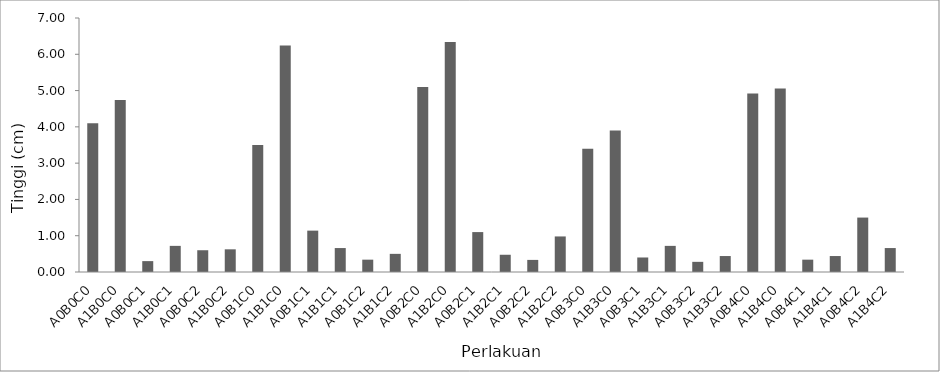
| Category | m22 |
|---|---|
| A0B0C0 | 4.1 |
| A1B0C0 | 4.74 |
| A0B0C1 | 0.3 |
| A1B0C1 | 0.72 |
| A0B0C2 | 0.6 |
| A1B0C2 | 0.625 |
| A0B1C0 | 3.5 |
| A1B1C0 | 6.24 |
| A0B1C1 | 1.14 |
| A1B1C1 | 0.66 |
| A0B1C2 | 0.34 |
| A1B1C2 | 0.5 |
| A0B2C0 | 5.1 |
| A1B2C0 | 6.34 |
| A0B2C1 | 1.1 |
| A1B2C1 | 0.475 |
| A0B2C2 | 0.333 |
| A1B2C2 | 0.98 |
| A0B3C0 | 3.4 |
| A1B3C0 | 3.9 |
| A0B3C1 | 0.4 |
| A1B3C1 | 0.72 |
| A0B3C2 | 0.28 |
| A1B3C2 | 0.44 |
| A0B4C0 | 4.92 |
| A1B4C0 | 5.06 |
| A0B4C1 | 0.34 |
| A1B4C1 | 0.44 |
| A0B4C2 | 1.5 |
| A1B4C2 | 0.66 |